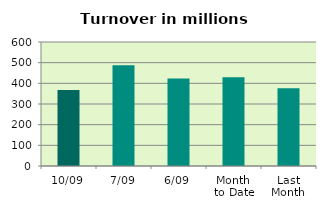
| Category | Series 0 |
|---|---|
| 10/09 | 367.624 |
| 7/09 | 487.232 |
| 6/09 | 423.589 |
| Month 
to Date | 429.255 |
| Last
Month | 376.258 |